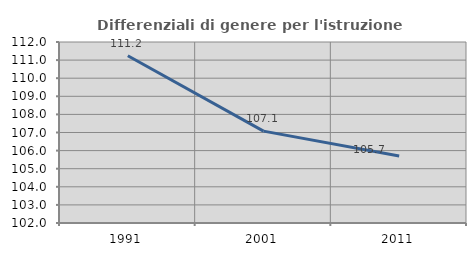
| Category | Differenziali di genere per l'istruzione superiore |
|---|---|
| 1991.0 | 111.239 |
| 2001.0 | 107.075 |
| 2011.0 | 105.7 |